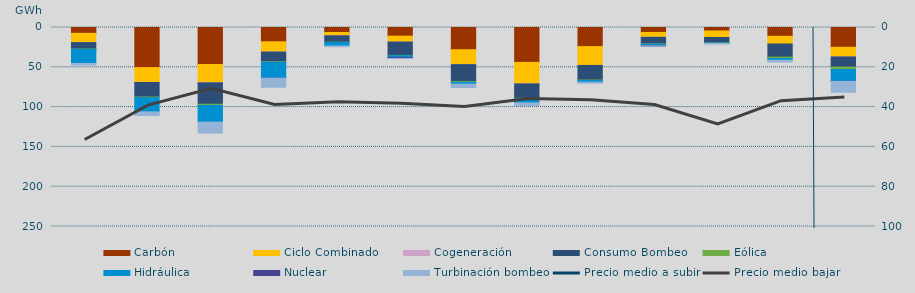
| Category | Carbón | Ciclo Combinado | Cogeneración | Consumo Bombeo | Eólica | Hidráulica | Nuclear | Turbinación bombeo |
|---|---|---|---|---|---|---|---|---|
| 0 | 7306.9 | 11559.1 | 88 | 7999 | 402.8 | 17797.7 | 0 | 1941.3 |
| 1 | 50376 | 18600.8 | 92.8 | 18257.2 | 867.9 | 17793.5 | 0 | 4596.7 |
| 2 | 46429 | 22875.8 | 230 | 26858.5 | 1566 | 20878.9 | 0 | 13810.2 |
| 3 | 17956.2 | 12815.5 | 103.4 | 12162.2 | 688.3 | 19850.2 | 66 | 11430.1 |
| 4 | 6283.8 | 4145.3 | 18.9 | 7977.8 | 313 | 4389.8 | 0 | 935.6 |
| 5 | 10864.5 | 7378.2 | 88.1 | 16621.4 | 464.4 | 2067.3 | 1381.8 | 160.4 |
| 6 | 27924.7 | 18737.8 | 26.5 | 21039.7 | 1083.3 | 2318.1 | 0 | 4314 |
| 7 | 43819.1 | 26947.4 | 131.4 | 18038.2 | 700.3 | 5037 | 0 | 3400 |
| 8 | 23995.8 | 23603.4 | 120.4 | 18312.9 | 630.7 | 2095.3 | 0 | 1288.4 |
| 9 | 6238.1 | 6107.2 | 11.4 | 8233.1 | 466.1 | 1774.5 | 300.5 | 185 |
| 10 | 4345.4 | 8205.3 | 0 | 6736.7 | 204.5 | 506 | 0 | 802.1 |
| 11 | 11031.5 | 9660.7 | 0 | 16502.5 | 1775.9 | 2151.2 | 0 | 2234.6 |
| 12 | 24843.5 | 12025 | 139.2 | 12696.1 | 3036.8 | 14862.1 | 109.8 | 13649 |